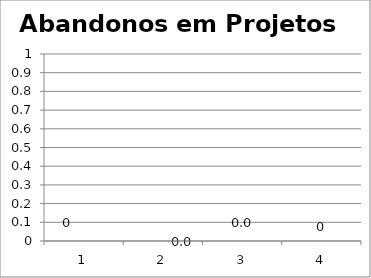
| Category | Series 0 |
|---|---|
| 1 | 0 |
| 2 | 0 |
| 3 | 0 |
| 4 | 0 |